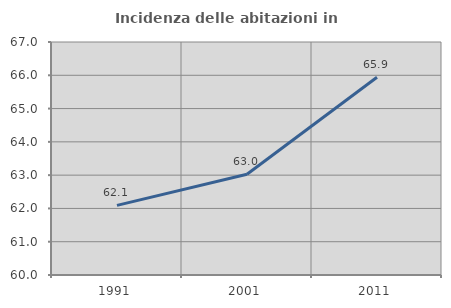
| Category | Incidenza delle abitazioni in proprietà  |
|---|---|
| 1991.0 | 62.091 |
| 2001.0 | 63.026 |
| 2011.0 | 65.942 |